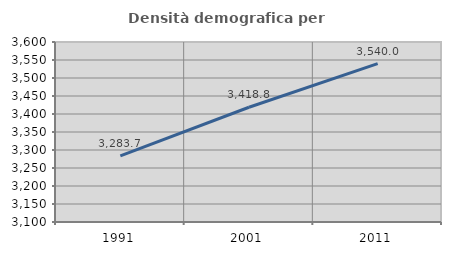
| Category | Densità demografica |
|---|---|
| 1991.0 | 3283.728 |
| 2001.0 | 3418.773 |
| 2011.0 | 3540.047 |